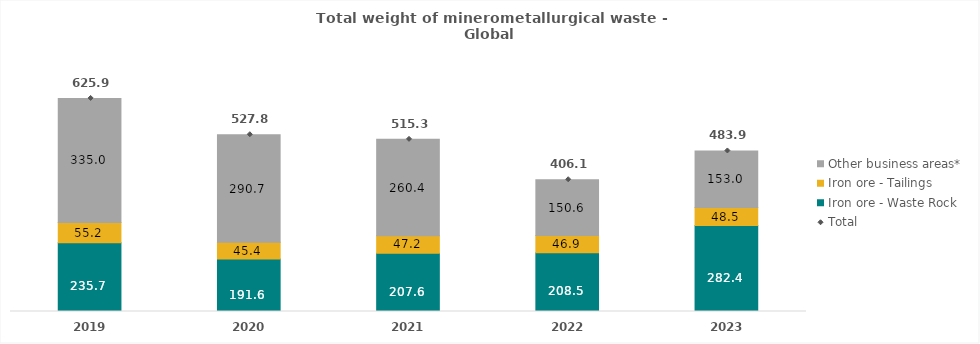
| Category | Iron ore - Waste Rock | Iron ore - Tailings | Other business areas* |
|---|---|---|---|
| 2019.0 | 235.679 | 55.162 | 335.041 |
| 2020.0 | 191.625 | 45.394 | 290.741 |
| 2021.0 | 207.617 | 47.241 | 260.401 |
| 2022.0 | 208.5 | 46.9 | 150.609 |
| 2023.0 | 282.4 | 48.5 | 153 |